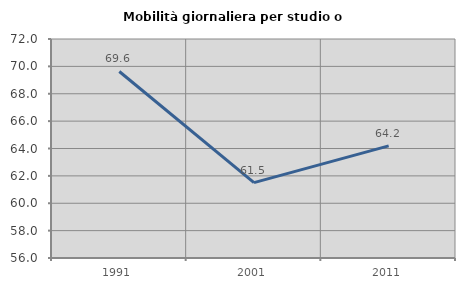
| Category | Mobilità giornaliera per studio o lavoro |
|---|---|
| 1991.0 | 69.626 |
| 2001.0 | 61.506 |
| 2011.0 | 64.191 |